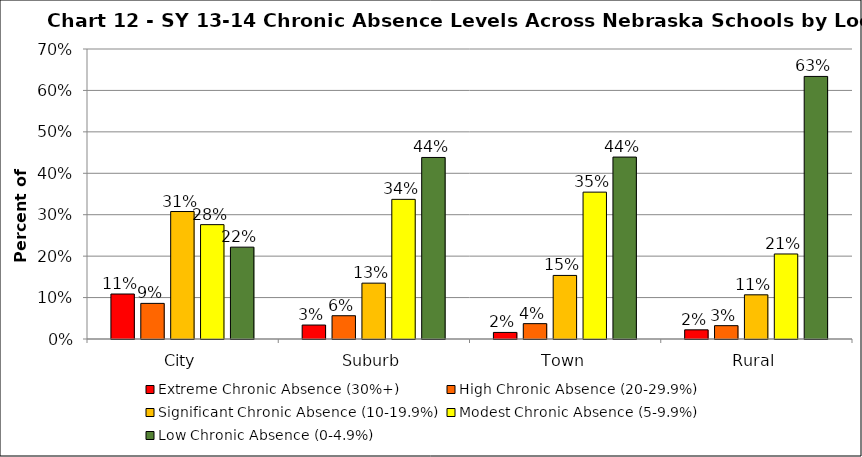
| Category | Extreme Chronic Absence (30%+) | High Chronic Absence (20-29.9%) | Significant Chronic Absence (10-19.9%) | Modest Chronic Absence (5-9.9%) | Low Chronic Absence (0-4.9%) |
|---|---|---|---|---|---|
| 0 | 0.109 | 0.086 | 0.308 | 0.276 | 0.222 |
| 1 | 0.034 | 0.056 | 0.135 | 0.337 | 0.438 |
| 2 | 0.016 | 0.037 | 0.153 | 0.354 | 0.439 |
| 3 | 0.022 | 0.032 | 0.107 | 0.205 | 0.634 |